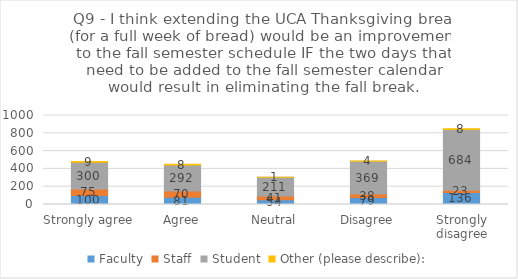
| Category | Faculty | Staff | Student | Other (please describe): |
|---|---|---|---|---|
| Strongly agree | 100 | 75 | 300 | 9 |
| Agree | 81 | 70 | 292 | 8 |
| Neutral | 54 | 41 | 211 | 1 |
| Disagree | 79 | 38 | 369 | 4 |
| Strongly disagree | 136 | 23 | 684 | 8 |